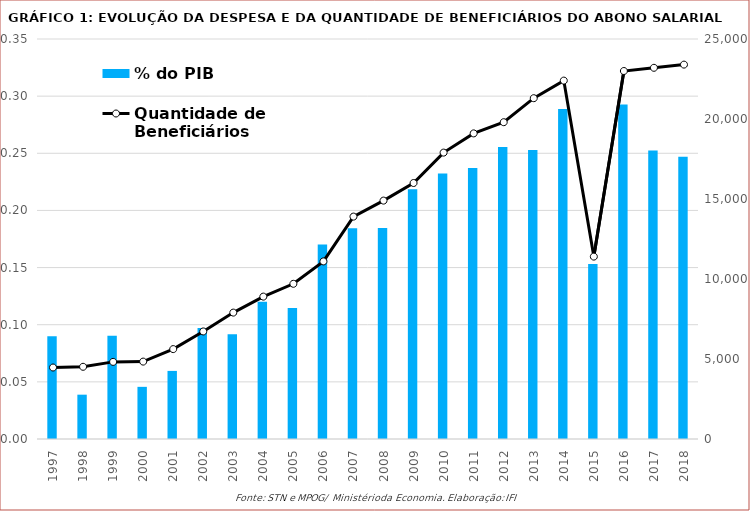
| Category | % do PIB |
|---|---|
| 1997.0 | 0.09 |
| 1998.0 | 0.039 |
| 1999.0 | 0.09 |
| 2000.0 | 0.046 |
| 2001.0 | 0.06 |
| 2002.0 | 0.097 |
| 2003.0 | 0.092 |
| 2004.0 | 0.12 |
| 2005.0 | 0.115 |
| 2006.0 | 0.17 |
| 2007.0 | 0.184 |
| 2008.0 | 0.185 |
| 2009.0 | 0.218 |
| 2010.0 | 0.232 |
| 2011.0 | 0.237 |
| 2012.0 | 0.256 |
| 2013.0 | 0.253 |
| 2014.0 | 0.289 |
| 2015.0 | 0.153 |
| 2016.0 | 0.293 |
| 2017.0 | 0.253 |
| 2018.0 | 0.247 |